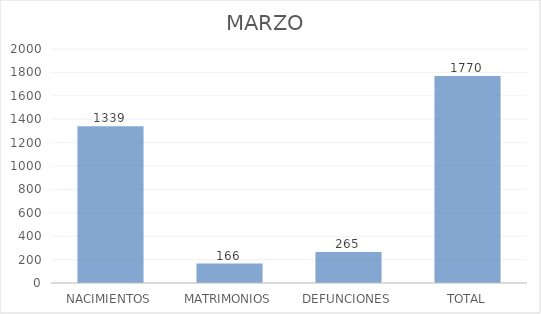
| Category | MARZO |
|---|---|
| NACIMIENTOS | 1339 |
| MATRIMONIOS | 166 |
| DEFUNCIONES | 265 |
| TOTAL | 1770 |